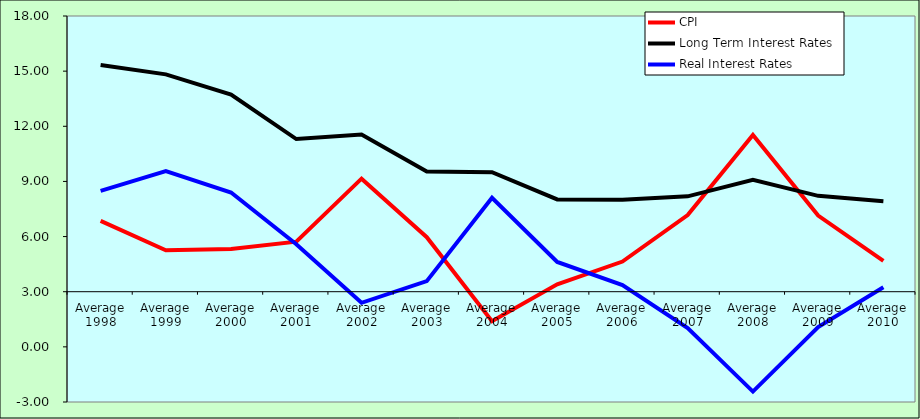
| Category | CPI | Long Term Interest Rates | Real Interest Rates |
|---|---|---|---|
| Average 1998 | 6.85 | 15.339 | 8.489 |
| Average 1999 | 5.258 | 14.825 | 9.567 |
| Average 2000 | 5.325 | 13.722 | 8.397 |
| Average 2001 | 5.725 | 11.306 | 5.581 |
| Average 2002 | 9.15 | 11.548 | 2.398 |
| Average 2003 | 5.967 | 9.542 | 3.575 |
| Average 2004 | 1.392 | 9.5 | 8.108 |
| Average 2005 | 3.4 | 8.022 | 4.622 |
| Average 2006 | 4.642 | 8.001 | 3.359 |
| Average 2007 | 7.173 | 8.19 | 1.017 |
| Average 2008 | 11.525 | 9.092 | -2.432 |
| Average 2009 | 7.142 | 8.216 | 1.074 |
| Average 2010 | 4.683 | 7.926 | 3.242 |